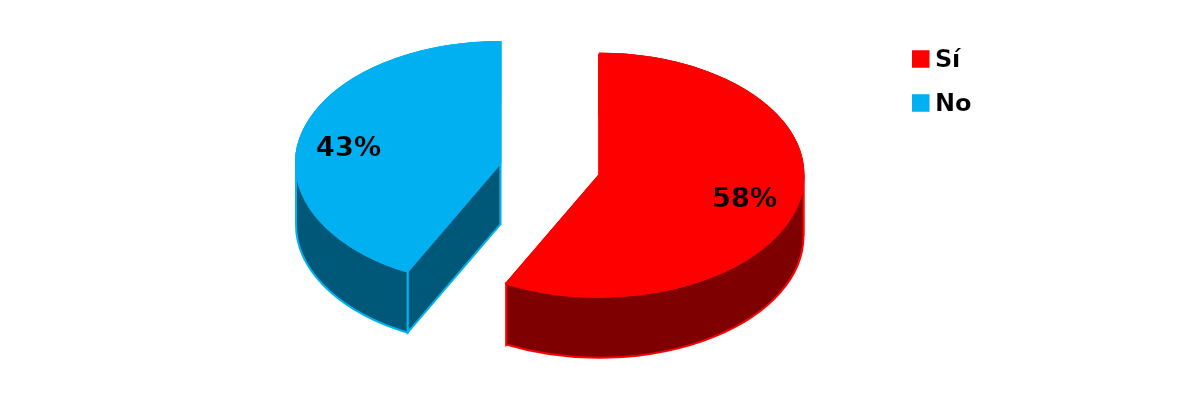
| Category | Series 0 |
|---|---|
| Sí | 23 |
| No | 17 |